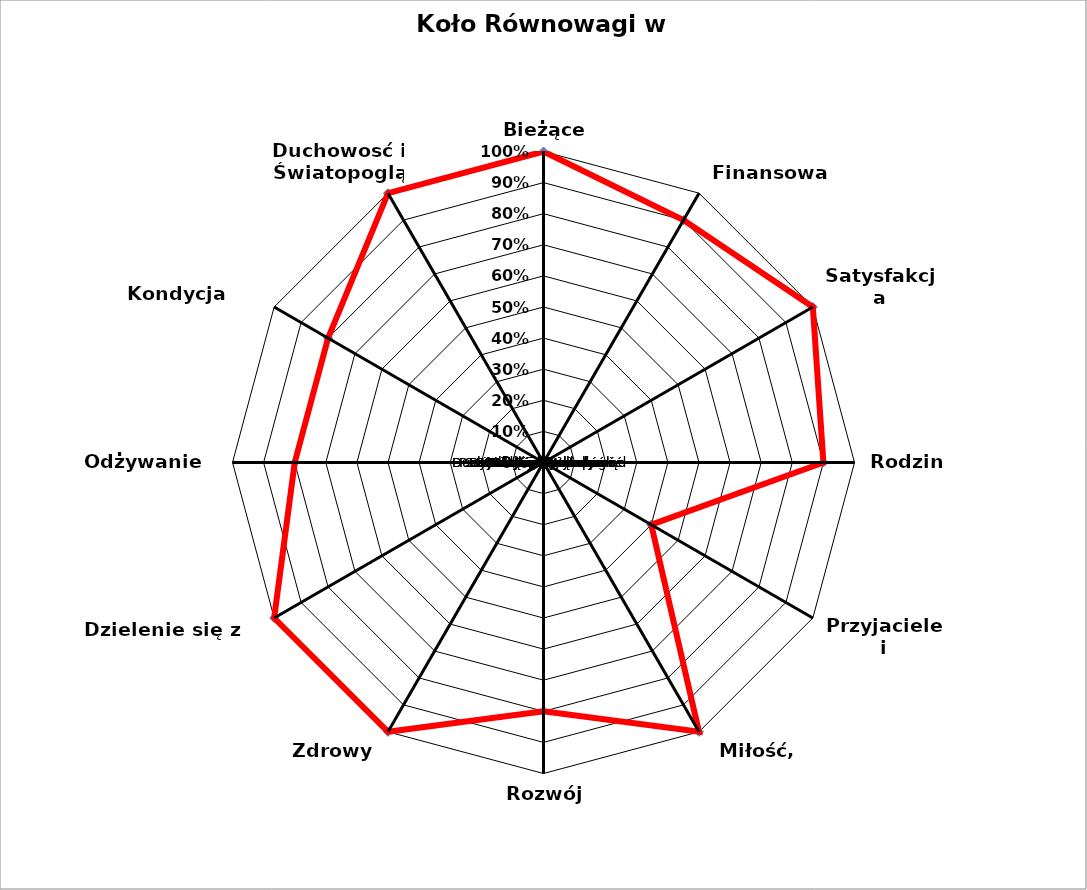
| Category | Series 0 | Series 1 | Series 2 | Series 3 | Series 4 |
|---|---|---|---|---|---|
| Bieżące dochody | 1 |  |  |  |  |
| Finansowa Wolność | 0.9 |  |  |  |  |
| Satysfakcja Zawodowa | 1 |  |  |  |  |
| Rodzina | 0.9 |  |  |  |  |
| Przyjaciele i Społeczność | 0.4 |  |  |  |  |
| Miłość, Związek | 1 |  |  |  |  |
| Rozwój Osobisty | 0.8 |  |  |  |  |
| Zdrowy Egoizm | 1 |  |  |  |  |
| Dzielenie się z innymi | 1 |  |  |  |  |
| Odżywanie ciała | 0.8 |  |  |  |  |
| Kondycja Fizyczna | 0.8 |  |  |  |  |
| Duchowosć i Światopogląd | 1 |  |  |  |  |